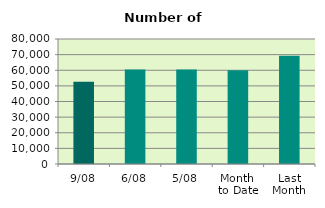
| Category | Series 0 |
|---|---|
| 9/08 | 52606 |
| 6/08 | 60440 |
| 5/08 | 60472 |
| Month 
to Date | 59984.667 |
| Last
Month | 69237.818 |